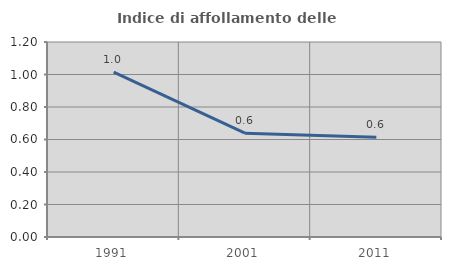
| Category | Indice di affollamento delle abitazioni  |
|---|---|
| 1991.0 | 1.014 |
| 2001.0 | 0.639 |
| 2011.0 | 0.614 |